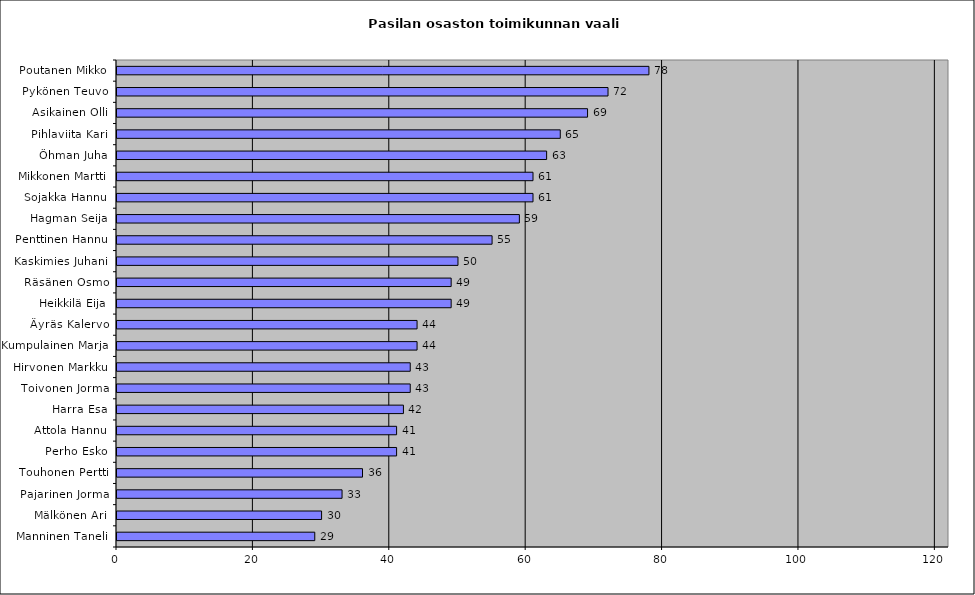
| Category | Series 0 |
|---|---|
| Poutanen Mikko | 78 |
| Pykönen Teuvo | 72 |
| Asikainen Olli | 69 |
| Pihlaviita Kari | 65 |
| Öhman Juha | 63 |
| Mikkonen Martti | 61 |
| Sojakka Hannu | 61 |
| Hagman Seija | 59 |
| Penttinen Hannu | 55 |
| Kaskimies Juhani | 50 |
| Räsänen Osmo | 49 |
| Heikkilä Eija | 49 |
| Äyräs Kalervo | 44 |
| Kumpulainen Marja | 44 |
| Hirvonen Markku | 43 |
| Toivonen Jorma | 43 |
| Harra Esa | 42 |
| Attola Hannu | 41 |
| Perho Esko | 41 |
| Touhonen Pertti | 36 |
| Pajarinen Jorma | 33 |
| Mälkönen Ari | 30 |
| Manninen Taneli | 29 |